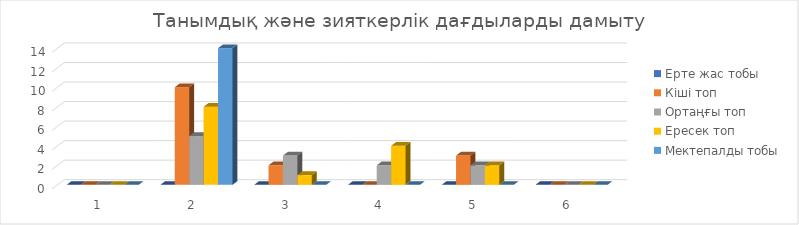
| Category | Ерте жас тобы  | Кіші топ | Ортаңғы топ | Ересек топ | Мектепалды тобы |
|---|---|---|---|---|---|
| 0 | 0 | 0 | 0 | 0 | 0 |
| 1 | 0 | 10 | 5 | 8 | 14 |
| 2 | 0 | 2 | 3 | 1 | 0 |
| 3 | 0 | 0 | 2 | 4 | 0 |
| 4 | 0 | 3 | 2 | 2 | 0 |
| 5 | 0 | 0 | 0 | 0 | 0 |